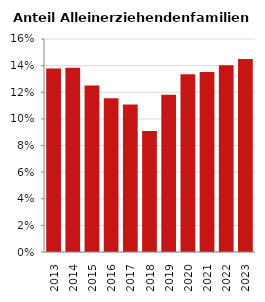
| Category | Anteil Alleinerziehende an Familien |
|---|---|
| 2013.0 | 0.138 |
| 2014.0 | 0.138 |
| 2015.0 | 0.125 |
| 2016.0 | 0.116 |
| 2017.0 | 0.111 |
| 2018.0 | 0.091 |
| 2019.0 | 0.118 |
| 2020.0 | 0.134 |
| 2021.0 | 0.135 |
| 2022.0 | 0.14 |
| 2023.0 | 0.145 |